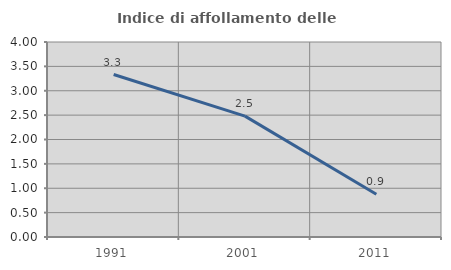
| Category | Indice di affollamento delle abitazioni  |
|---|---|
| 1991.0 | 3.333 |
| 2001.0 | 2.479 |
| 2011.0 | 0.877 |